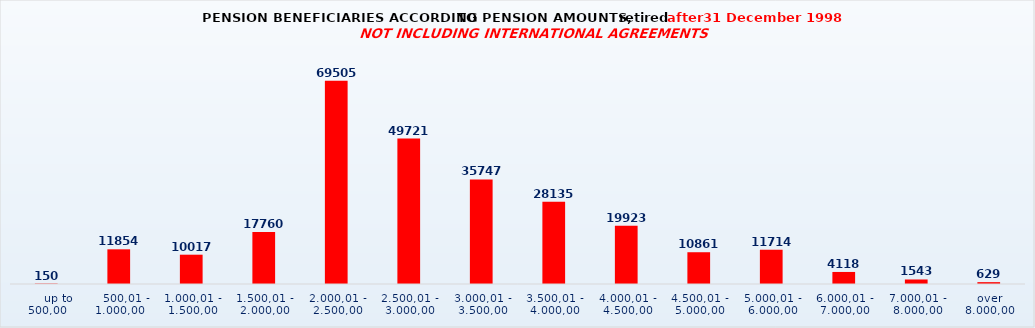
| Category | Series 0 |
|---|---|
|      up to 500,00 | 150 |
|    500,01 - 1.000,00 | 11854 |
| 1.000,01 - 1.500,00 | 10017 |
| 1.500,01 - 2.000,00 | 17760 |
| 2.000,01 - 2.500,00 | 69505 |
| 2.500,01 - 3.000,00 | 49721 |
| 3.000,01 - 3.500,00 | 35747 |
| 3.500,01 - 4.000,00 | 28135 |
| 4.000,01 - 4.500,00 | 19923 |
| 4.500,01 - 5.000,00 | 10861 |
| 5.000,01 - 6.000,00 | 11714 |
| 6.000,01 - 7.000,00 | 4118 |
| 7.000,01 - 8.000,00 | 1543 |
| over 8.000,00 | 629 |